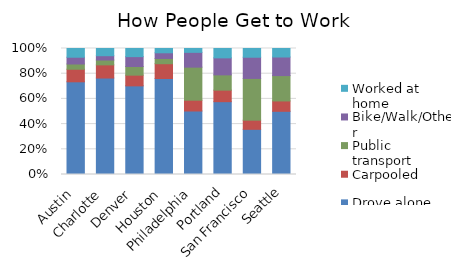
| Category | Drove alone | Carpooled | Public transport | Bike/Walk/Other | Worked at home |
|---|---|---|---|---|---|
| Austin | 0.736 | 0.1 | 0.042 | 0.054 | 0.069 |
| Charlotte | 0.766 | 0.104 | 0.038 | 0.034 | 0.057 |
| Denver | 0.703 | 0.085 | 0.068 | 0.079 | 0.065 |
| Houston | 0.762 | 0.118 | 0.042 | 0.045 | 0.034 |
| Philadelphia | 0.504 | 0.086 | 0.262 | 0.118 | 0.031 |
| Portland | 0.578 | 0.092 | 0.121 | 0.135 | 0.074 |
| San Francisco | 0.359 | 0.073 | 0.331 | 0.168 | 0.07 |
| Seattle | 0.501 | 0.082 | 0.201 | 0.148 | 0.067 |